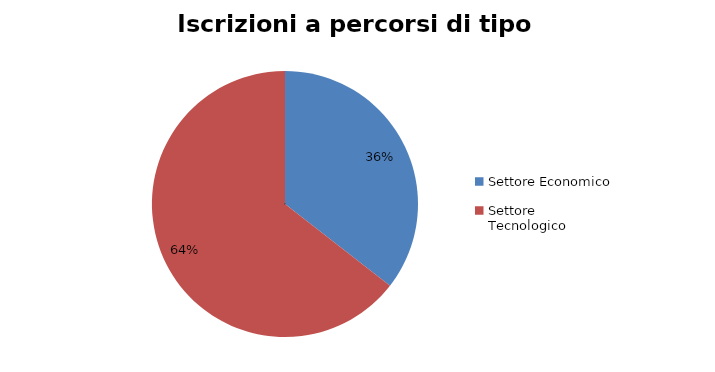
| Category | Series 0 |
|---|---|
| Settore Economico | 4847 |
| Settore Tecnologico | 8799 |